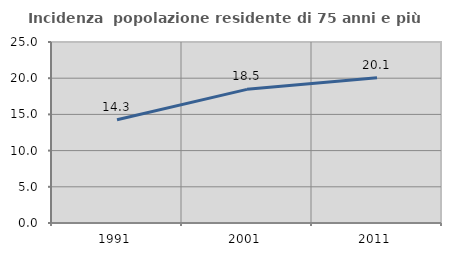
| Category | Incidenza  popolazione residente di 75 anni e più |
|---|---|
| 1991.0 | 14.261 |
| 2001.0 | 18.461 |
| 2011.0 | 20.057 |